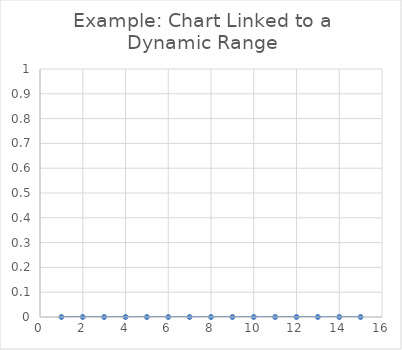
| Category | X |
|---|---|
| 1.0 | 1 |
| 2.0 | 4 |
| 3.0 | 9 |
| 4.0 | 16 |
| 5.0 | 25 |
| 6.0 | 36 |
| 7.0 | 49 |
| 8.0 | 64 |
| 9.0 | 81 |
| 10.0 | 100 |
| 11.0 | 121 |
| 12.0 | 144 |
| 13.0 | 169 |
| 14.0 | 196 |
| 15.0 | 225 |